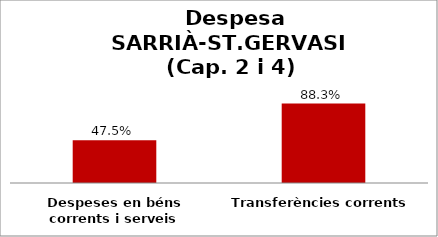
| Category | Series 0 |
|---|---|
| Despeses en béns corrents i serveis | 0.475 |
| Transferències corrents | 0.883 |